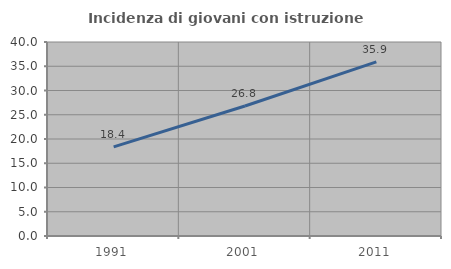
| Category | Incidenza di giovani con istruzione universitaria |
|---|---|
| 1991.0 | 18.376 |
| 2001.0 | 26.797 |
| 2011.0 | 35.897 |